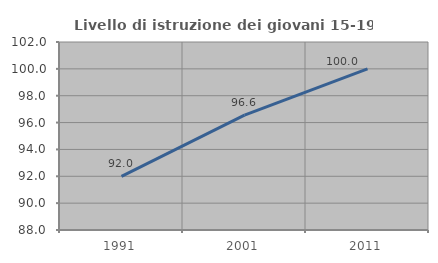
| Category | Livello di istruzione dei giovani 15-19 anni |
|---|---|
| 1991.0 | 92 |
| 2001.0 | 96.552 |
| 2011.0 | 100 |